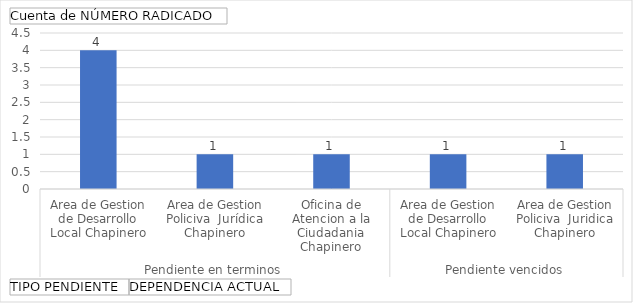
| Category | Total |
|---|---|
| 0 | 4 |
| 1 | 1 |
| 2 | 1 |
| 3 | 1 |
| 4 | 1 |